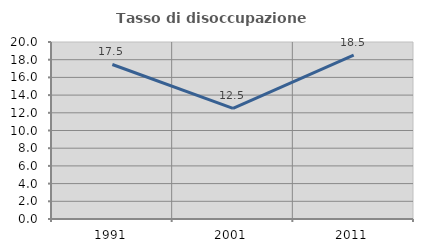
| Category | Tasso di disoccupazione giovanile  |
|---|---|
| 1991.0 | 17.46 |
| 2001.0 | 12.5 |
| 2011.0 | 18.519 |